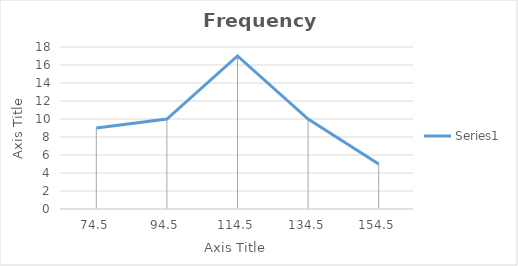
| Category | Series 0 |
|---|---|
| 74.5 | 9 |
| 94.5 | 10 |
| 114.5 | 17 |
| 134.5 | 10 |
| 154.5 | 5 |